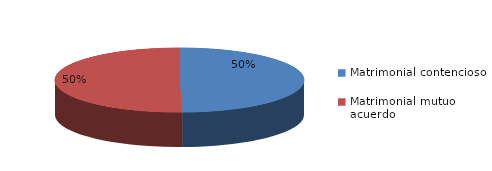
| Category | Series 0 |
|---|---|
| 0 | 977 |
| 1 | 990 |